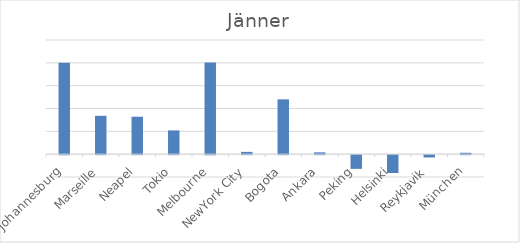
| Category | Jänner |
|---|---|
| Johannesburg | 20 |
| Marseille | 8.4 |
| Neapel | 8.2 |
| Tokio | 5.2 |
| Melbourne | 20.1 |
| NewYork City | 0.5 |
| Bogota | 12 |
| Ankara | 0.4 |
| Peking | -3 |
| Helsinki | -3.9 |
| Reykjavik | -0.5 |
| München | 0.3 |